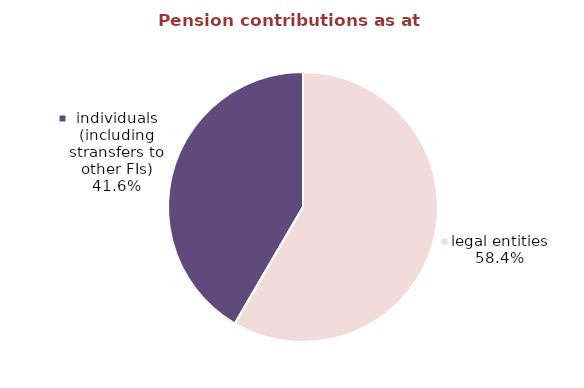
| Category | Series 0 |
|---|---|
| legal entities | 867.316 |
| private entrepreneurs (FOPs) | 0.276 |
| individuals (including stransfers to other FIs) | 617.369 |